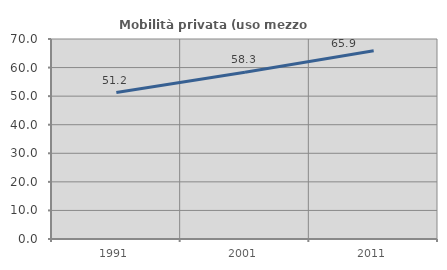
| Category | Mobilità privata (uso mezzo privato) |
|---|---|
| 1991.0 | 51.244 |
| 2001.0 | 58.333 |
| 2011.0 | 65.865 |